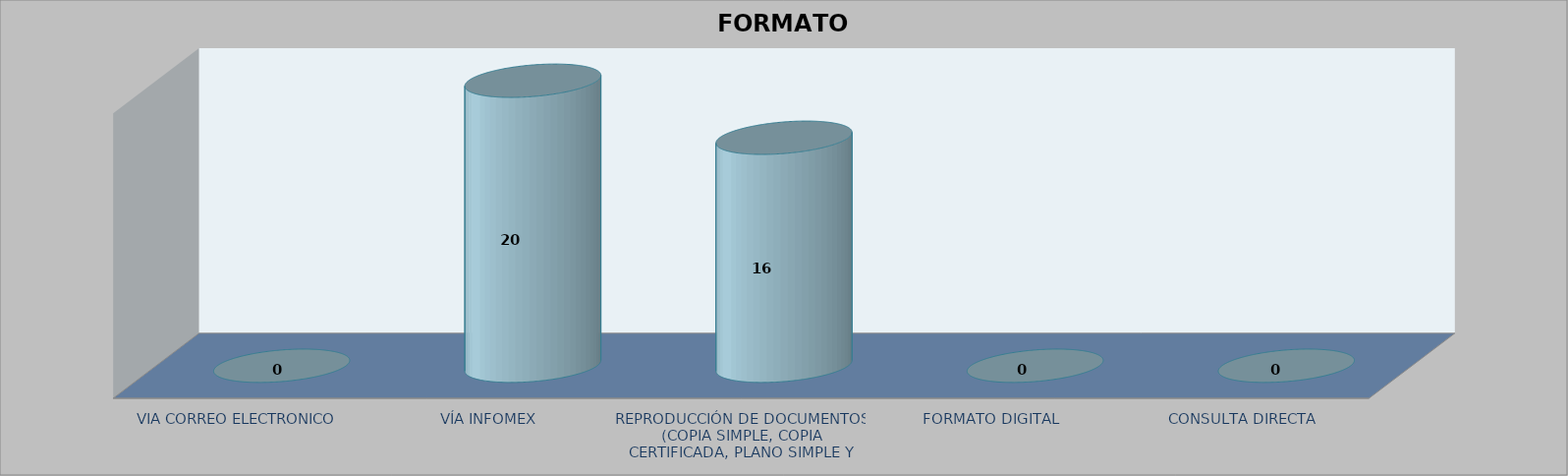
| Category |        FORMATO SOLICITADO | Series 1 | Series 2 |
|---|---|---|---|
| VIA CORREO ELECTRONICO |  |  | 0 |
| VÍA INFOMEX |  |  | 20 |
| REPRODUCCIÓN DE DOCUMENTOS (COPIA SIMPLE, COPIA CERTIFICADA, PLANO SIMPLE Y PLANO CERTIFICADO) |  |  | 16 |
| FORMATO DIGITAL |  |  | 0 |
| CONSULTA DIRECTA |  |  | 0 |